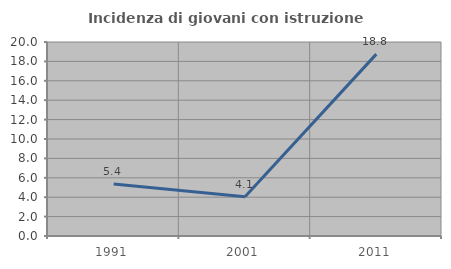
| Category | Incidenza di giovani con istruzione universitaria |
|---|---|
| 1991.0 | 5.357 |
| 2001.0 | 4.054 |
| 2011.0 | 18.75 |